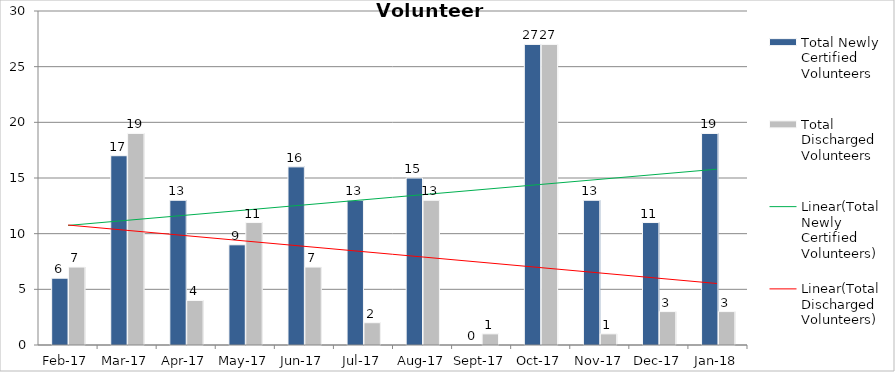
| Category | Total Newly Certified Volunteers | Total Discharged Volunteers |
|---|---|---|
| 2017-02-01 | 6 | 7 |
| 2017-03-01 | 17 | 19 |
| 2017-04-01 | 13 | 4 |
| 2017-05-01 | 9 | 11 |
| 2017-06-01 | 16 | 7 |
| 2017-07-01 | 13 | 2 |
| 2017-08-01 | 15 | 13 |
| 2017-09-01 | 0 | 1 |
| 2017-10-01 | 27 | 27 |
| 2017-11-01 | 13 | 1 |
| 2017-12-01 | 11 | 3 |
| 2018-01-01 | 19 | 3 |